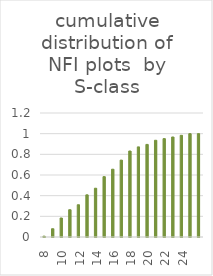
| Category | Series 0 |
|---|---|
| 8.0 | 0.008 |
| 9.0 | 0.08 |
| 10.0 | 0.184 |
| 11.0 | 0.264 |
| 12.0 | 0.312 |
| 13.0 | 0.408 |
| 14.0 | 0.472 |
| 15.0 | 0.584 |
| 16.0 | 0.656 |
| 17.0 | 0.744 |
| 18.0 | 0.832 |
| 19.0 | 0.872 |
| 20.0 | 0.896 |
| 21.0 | 0.936 |
| 22.0 | 0.952 |
| 23.0 | 0.968 |
| 24.0 | 0.984 |
| 25.0 | 1 |